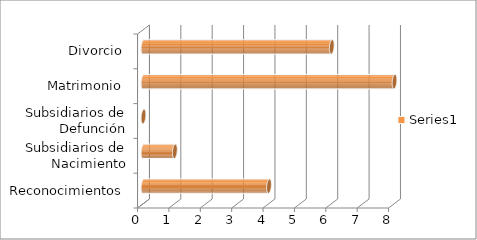
| Category | Series 0 |
|---|---|
| Reconocimientos | 4 |
| Subsidiarios de Nacimiento | 1 |
| Subsidiarios de Defunción | 0 |
| Matrimonio | 8 |
| Divorcio | 6 |